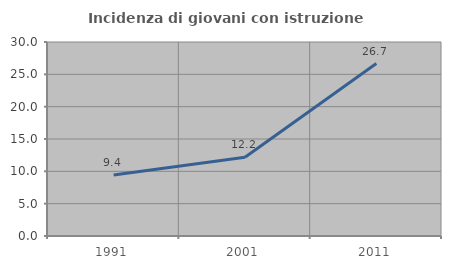
| Category | Incidenza di giovani con istruzione universitaria |
|---|---|
| 1991.0 | 9.443 |
| 2001.0 | 12.179 |
| 2011.0 | 26.667 |